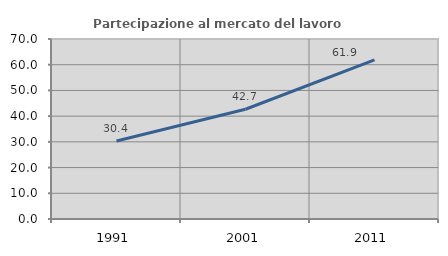
| Category | Partecipazione al mercato del lavoro  femminile |
|---|---|
| 1991.0 | 30.364 |
| 2001.0 | 42.688 |
| 2011.0 | 61.852 |